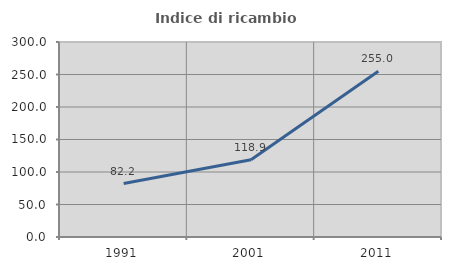
| Category | Indice di ricambio occupazionale  |
|---|---|
| 1991.0 | 82.222 |
| 2001.0 | 118.919 |
| 2011.0 | 255 |